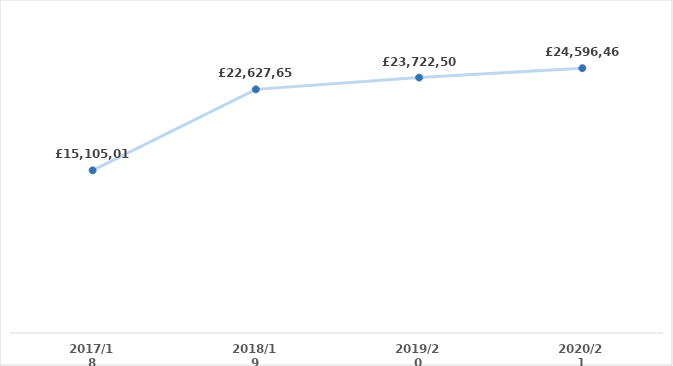
| Category | Series 0 |
|---|---|
| 2017/18 | 15105014.25 |
| 2018/19 | 22627657 |
| 2019/20 | 23722500 |
| 2020/21 | 24596464.126 |